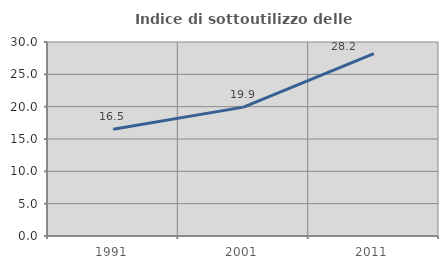
| Category | Indice di sottoutilizzo delle abitazioni  |
|---|---|
| 1991.0 | 16.515 |
| 2001.0 | 19.932 |
| 2011.0 | 28.192 |